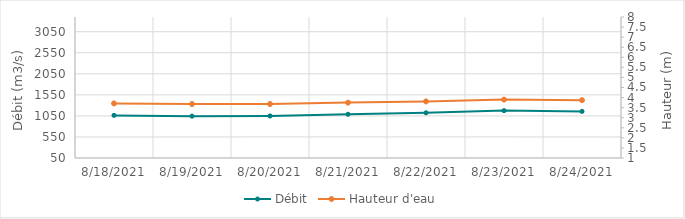
| Category | Débit |
|---|---|
| 6/6/21 | 3111.95 |
| 6/5/21 | 3178.63 |
| 6/4/21 | 3232.52 |
| 6/3/21 | 3221.12 |
| 6/2/21 | 3142.4 |
| 6/1/21 | 2993.93 |
| 5/31/21 | 2860.66 |